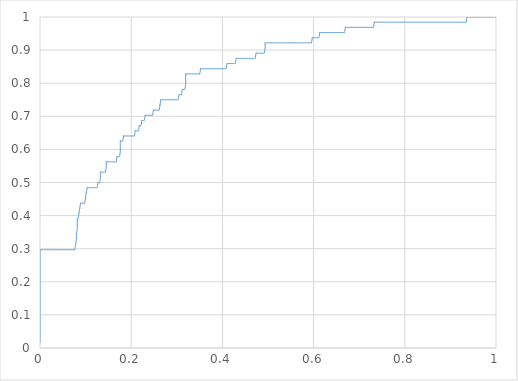
| Category | Series 0 |
|---|---|
| 0.0 | 0.016 |
| 0.0 | 0.031 |
| 0.0 | 0.047 |
| 0.0 | 0.062 |
| 0.0 | 0.078 |
| 0.0 | 0.094 |
| 0.0 | 0.109 |
| 0.0 | 0.125 |
| 0.0 | 0.141 |
| 0.0 | 0.156 |
| 0.0 | 0.172 |
| 0.0 | 0.188 |
| 0.0 | 0.203 |
| 0.0 | 0.219 |
| 0.0 | 0.234 |
| 0.0 | 0.25 |
| 0.0 | 0.266 |
| 0.0 | 0.281 |
| 0.0 | 0.297 |
| 0.0 | 0.297 |
| 0.001814882032667886 | 0.297 |
| 0.003629764065335772 | 0.297 |
| 0.005444646098003658 | 0.297 |
| 0.007259528130671544 | 0.297 |
| 0.00907441016333943 | 0.297 |
| 0.010889292196007205 | 0.297 |
| 0.012704174228675091 | 0.297 |
| 0.014519056261342977 | 0.297 |
| 0.016333938294010864 | 0.297 |
| 0.01814882032667875 | 0.297 |
| 0.019963702359346636 | 0.297 |
| 0.02177858439201452 | 0.297 |
| 0.023593466424682408 | 0.297 |
| 0.025408348457350294 | 0.297 |
| 0.02722323049001818 | 0.297 |
| 0.029038112522686066 | 0.297 |
| 0.030852994555353952 | 0.297 |
| 0.03266787658802173 | 0.297 |
| 0.03448275862068961 | 0.297 |
| 0.0362976406533575 | 0.297 |
| 0.038112522686025385 | 0.297 |
| 0.03992740471869327 | 0.297 |
| 0.04174228675136116 | 0.297 |
| 0.04355716878402904 | 0.297 |
| 0.04537205081669693 | 0.297 |
| 0.047186932849364815 | 0.297 |
| 0.0490018148820327 | 0.297 |
| 0.05081669691470059 | 0.297 |
| 0.052631578947368474 | 0.297 |
| 0.05444646098003625 | 0.297 |
| 0.056261343012704135 | 0.297 |
| 0.05807622504537202 | 0.297 |
| 0.05989110707803991 | 0.297 |
| 0.06170598911070779 | 0.297 |
| 0.06352087114337568 | 0.297 |
| 0.06533575317604357 | 0.297 |
| 0.06715063520871145 | 0.297 |
| 0.06896551724137934 | 0.297 |
| 0.07078039927404722 | 0.297 |
| 0.07259528130671511 | 0.297 |
| 0.074410163339383 | 0.297 |
| 0.07622504537205077 | 0.297 |
| 0.07803992740471866 | 0.312 |
| 0.07803992740471866 | 0.312 |
| 0.07985480943738654 | 0.328 |
| 0.07985480943738654 | 0.344 |
| 0.07985480943738654 | 0.344 |
| 0.08166969147005443 | 0.359 |
| 0.08166969147005443 | 0.375 |
| 0.08166969147005443 | 0.391 |
| 0.08166969147005443 | 0.391 |
| 0.08348457350272231 | 0.391 |
| 0.0852994555353902 | 0.406 |
| 0.0852994555353902 | 0.406 |
| 0.08711433756805809 | 0.422 |
| 0.08711433756805809 | 0.422 |
| 0.08892921960072597 | 0.438 |
| 0.08892921960072597 | 0.438 |
| 0.09074410163339386 | 0.438 |
| 0.09255898366606174 | 0.438 |
| 0.09437386569872963 | 0.438 |
| 0.0961887477313974 | 0.438 |
| 0.09800362976406529 | 0.438 |
| 0.09981851179673318 | 0.453 |
| 0.09981851179673318 | 0.453 |
| 0.10163339382940106 | 0.469 |
| 0.10163339382940106 | 0.469 |
| 0.10344827586206895 | 0.484 |
| 0.10344827586206895 | 0.484 |
| 0.10526315789473684 | 0.484 |
| 0.10707803992740472 | 0.484 |
| 0.10889292196007261 | 0.484 |
| 0.1107078039927405 | 0.484 |
| 0.11252268602540838 | 0.484 |
| 0.11433756805807627 | 0.484 |
| 0.11615245009074415 | 0.484 |
| 0.11796733212341193 | 0.484 |
| 0.11978221415607981 | 0.484 |
| 0.1215970961887477 | 0.484 |
| 0.12341197822141559 | 0.484 |
| 0.12522686025408347 | 0.484 |
| 0.12704174228675136 | 0.5 |
| 0.12704174228675136 | 0.5 |
| 0.12885662431941924 | 0.5 |
| 0.13067150635208713 | 0.5 |
| 0.13248638838475502 | 0.516 |
| 0.13248638838475502 | 0.531 |
| 0.13248638838475502 | 0.531 |
| 0.1343012704174229 | 0.531 |
| 0.1361161524500908 | 0.531 |
| 0.13793103448275867 | 0.531 |
| 0.13974591651542645 | 0.531 |
| 0.14156079854809434 | 0.531 |
| 0.14337568058076222 | 0.531 |
| 0.1451905626134301 | 0.547 |
| 0.1451905626134301 | 0.562 |
| 0.1451905626134301 | 0.562 |
| 0.147005444646098 | 0.562 |
| 0.14882032667876588 | 0.562 |
| 0.15063520871143377 | 0.562 |
| 0.15245009074410165 | 0.562 |
| 0.15426497277676954 | 0.562 |
| 0.15607985480943742 | 0.562 |
| 0.1578947368421053 | 0.562 |
| 0.15970961887477308 | 0.562 |
| 0.16152450090744097 | 0.562 |
| 0.16333938294010886 | 0.562 |
| 0.16515426497277674 | 0.562 |
| 0.16696914700544463 | 0.562 |
| 0.16878402903811252 | 0.578 |
| 0.16878402903811252 | 0.578 |
| 0.1705989110707804 | 0.578 |
| 0.1724137931034483 | 0.578 |
| 0.17422867513611617 | 0.578 |
| 0.17604355716878406 | 0.594 |
| 0.17604355716878406 | 0.609 |
| 0.17604355716878406 | 0.625 |
| 0.17604355716878406 | 0.625 |
| 0.17785843920145195 | 0.625 |
| 0.17967332123411983 | 0.625 |
| 0.1814882032667876 | 0.625 |
| 0.1833030852994555 | 0.641 |
| 0.1833030852994555 | 0.641 |
| 0.18511796733212338 | 0.641 |
| 0.18693284936479126 | 0.641 |
| 0.18874773139745915 | 0.641 |
| 0.19056261343012704 | 0.641 |
| 0.19237749546279492 | 0.641 |
| 0.1941923774954628 | 0.641 |
| 0.1960072595281307 | 0.641 |
| 0.19782214156079858 | 0.641 |
| 0.19963702359346647 | 0.641 |
| 0.20145190562613435 | 0.641 |
| 0.20326678765880213 | 0.641 |
| 0.20508166969147001 | 0.641 |
| 0.2068965517241379 | 0.641 |
| 0.2087114337568058 | 0.656 |
| 0.2087114337568058 | 0.656 |
| 0.21052631578947367 | 0.656 |
| 0.21234119782214156 | 0.656 |
| 0.21415607985480944 | 0.656 |
| 0.21597096188747733 | 0.656 |
| 0.21778584392014522 | 0.672 |
| 0.21778584392014522 | 0.672 |
| 0.2196007259528131 | 0.672 |
| 0.221415607985481 | 0.672 |
| 0.22323049001814887 | 0.688 |
| 0.22323049001814887 | 0.688 |
| 0.22504537205081665 | 0.688 |
| 0.22686025408348454 | 0.688 |
| 0.22867513611615242 | 0.688 |
| 0.2304900181488203 | 0.703 |
| 0.2304900181488203 | 0.703 |
| 0.2323049001814882 | 0.703 |
| 0.23411978221415608 | 0.703 |
| 0.23593466424682397 | 0.703 |
| 0.23774954627949185 | 0.703 |
| 0.23956442831215974 | 0.703 |
| 0.24137931034482762 | 0.703 |
| 0.2431941923774955 | 0.703 |
| 0.24500907441016329 | 0.703 |
| 0.24682395644283117 | 0.703 |
| 0.24863883847549906 | 0.719 |
| 0.24863883847549906 | 0.719 |
| 0.25045372050816694 | 0.719 |
| 0.25226860254083483 | 0.719 |
| 0.2540834845735027 | 0.719 |
| 0.2558983666061706 | 0.719 |
| 0.2577132486388385 | 0.719 |
| 0.2595281306715064 | 0.719 |
| 0.26134301270417426 | 0.719 |
| 0.26315789473684215 | 0.734 |
| 0.26315789473684215 | 0.734 |
| 0.26497277676951003 | 0.75 |
| 0.26497277676951003 | 0.75 |
| 0.2667876588021778 | 0.75 |
| 0.2686025408348457 | 0.75 |
| 0.2704174228675136 | 0.75 |
| 0.27223230490018147 | 0.75 |
| 0.27404718693284935 | 0.75 |
| 0.27586206896551724 | 0.75 |
| 0.2776769509981851 | 0.75 |
| 0.279491833030853 | 0.75 |
| 0.2813067150635209 | 0.75 |
| 0.2831215970961888 | 0.75 |
| 0.28493647912885667 | 0.75 |
| 0.28675136116152455 | 0.75 |
| 0.28856624319419233 | 0.75 |
| 0.2903811252268602 | 0.75 |
| 0.2921960072595281 | 0.75 |
| 0.294010889292196 | 0.75 |
| 0.2958257713248639 | 0.75 |
| 0.29764065335753176 | 0.75 |
| 0.29945553539019965 | 0.75 |
| 0.30127041742286753 | 0.75 |
| 0.3030852994555354 | 0.75 |
| 0.3049001814882033 | 0.766 |
| 0.3049001814882033 | 0.766 |
| 0.3067150635208712 | 0.766 |
| 0.30852994555353896 | 0.766 |
| 0.31034482758620685 | 0.766 |
| 0.31215970961887474 | 0.781 |
| 0.31215970961887474 | 0.781 |
| 0.3139745916515426 | 0.781 |
| 0.3157894736842105 | 0.781 |
| 0.3176043557168784 | 0.781 |
| 0.3194192377495463 | 0.797 |
| 0.3194192377495463 | 0.812 |
| 0.3194192377495463 | 0.828 |
| 0.3194192377495463 | 0.828 |
| 0.32123411978221417 | 0.828 |
| 0.32304900181488205 | 0.828 |
| 0.32486388384754994 | 0.828 |
| 0.3266787658802178 | 0.828 |
| 0.3284936479128857 | 0.828 |
| 0.3303085299455535 | 0.828 |
| 0.3321234119782214 | 0.828 |
| 0.33393829401088926 | 0.828 |
| 0.33575317604355714 | 0.828 |
| 0.33756805807622503 | 0.828 |
| 0.3393829401088929 | 0.828 |
| 0.3411978221415608 | 0.828 |
| 0.3430127041742287 | 0.828 |
| 0.3448275862068966 | 0.828 |
| 0.34664246823956446 | 0.828 |
| 0.34845735027223235 | 0.828 |
| 0.35027223230490023 | 0.828 |
| 0.352087114337568 | 0.844 |
| 0.352087114337568 | 0.844 |
| 0.3539019963702359 | 0.844 |
| 0.3557168784029038 | 0.844 |
| 0.35753176043557167 | 0.844 |
| 0.35934664246823955 | 0.844 |
| 0.36116152450090744 | 0.844 |
| 0.3629764065335753 | 0.844 |
| 0.3647912885662432 | 0.844 |
| 0.3666061705989111 | 0.844 |
| 0.368421052631579 | 0.844 |
| 0.37023593466424687 | 0.844 |
| 0.37205081669691475 | 0.844 |
| 0.37386569872958253 | 0.844 |
| 0.3756805807622504 | 0.844 |
| 0.3774954627949183 | 0.844 |
| 0.3793103448275862 | 0.844 |
| 0.3811252268602541 | 0.844 |
| 0.38294010889292196 | 0.844 |
| 0.38475499092558985 | 0.844 |
| 0.38656987295825773 | 0.844 |
| 0.3883847549909256 | 0.844 |
| 0.3901996370235935 | 0.844 |
| 0.3920145190562614 | 0.844 |
| 0.39382940108892917 | 0.844 |
| 0.39564428312159705 | 0.844 |
| 0.39745916515426494 | 0.844 |
| 0.3992740471869328 | 0.844 |
| 0.4010889292196007 | 0.844 |
| 0.4029038112522686 | 0.844 |
| 0.4047186932849365 | 0.844 |
| 0.40653357531760437 | 0.844 |
| 0.40834845735027225 | 0.844 |
| 0.41016333938294014 | 0.859 |
| 0.41016333938294014 | 0.859 |
| 0.411978221415608 | 0.859 |
| 0.4137931034482759 | 0.859 |
| 0.4156079854809437 | 0.859 |
| 0.4174228675136116 | 0.859 |
| 0.41923774954627946 | 0.859 |
| 0.42105263157894735 | 0.859 |
| 0.42286751361161523 | 0.859 |
| 0.4246823956442831 | 0.859 |
| 0.426497277676951 | 0.859 |
| 0.4283121597096189 | 0.859 |
| 0.4301270417422868 | 0.875 |
| 0.4301270417422868 | 0.875 |
| 0.43194192377495466 | 0.875 |
| 0.43375680580762255 | 0.875 |
| 0.43557168784029043 | 0.875 |
| 0.4373865698729582 | 0.875 |
| 0.4392014519056261 | 0.875 |
| 0.441016333938294 | 0.875 |
| 0.44283121597096187 | 0.875 |
| 0.44464609800362975 | 0.875 |
| 0.44646098003629764 | 0.875 |
| 0.4482758620689655 | 0.875 |
| 0.4500907441016334 | 0.875 |
| 0.4519056261343013 | 0.875 |
| 0.4537205081669692 | 0.875 |
| 0.45553539019963707 | 0.875 |
| 0.45735027223230496 | 0.875 |
| 0.45916515426497273 | 0.875 |
| 0.4609800362976406 | 0.875 |
| 0.4627949183303085 | 0.875 |
| 0.4646098003629764 | 0.875 |
| 0.4664246823956443 | 0.875 |
| 0.46823956442831216 | 0.875 |
| 0.47005444646098005 | 0.875 |
| 0.47186932849364793 | 0.875 |
| 0.4736842105263158 | 0.891 |
| 0.4736842105263158 | 0.891 |
| 0.4754990925589837 | 0.891 |
| 0.4773139745916516 | 0.891 |
| 0.47912885662431937 | 0.891 |
| 0.48094373865698725 | 0.891 |
| 0.48275862068965514 | 0.891 |
| 0.484573502722323 | 0.891 |
| 0.4863883847549909 | 0.891 |
| 0.4882032667876588 | 0.891 |
| 0.4900181488203267 | 0.891 |
| 0.49183303085299457 | 0.891 |
| 0.49364791288566245 | 0.906 |
| 0.49364791288566245 | 0.922 |
| 0.49364791288566245 | 0.922 |
| 0.49546279491833034 | 0.922 |
| 0.4972776769509982 | 0.922 |
| 0.4990925589836661 | 0.922 |
| 0.5009074410163339 | 0.922 |
| 0.5027223230490019 | 0.922 |
| 0.5045372050816697 | 0.922 |
| 0.5063520871143375 | 0.922 |
| 0.5081669691470054 | 0.922 |
| 0.5099818511796733 | 0.922 |
| 0.5117967332123412 | 0.922 |
| 0.5136116152450091 | 0.922 |
| 0.515426497277677 | 0.922 |
| 0.5172413793103448 | 0.922 |
| 0.5190562613430127 | 0.922 |
| 0.5208711433756805 | 0.922 |
| 0.5226860254083485 | 0.922 |
| 0.5245009074410163 | 0.922 |
| 0.5263157894736843 | 0.922 |
| 0.5281306715063521 | 0.922 |
| 0.52994555353902 | 0.922 |
| 0.5317604355716878 | 0.922 |
| 0.5335753176043557 | 0.922 |
| 0.5353901996370236 | 0.922 |
| 0.5372050816696915 | 0.922 |
| 0.5390199637023594 | 0.922 |
| 0.5408348457350272 | 0.922 |
| 0.5426497277676952 | 0.922 |
| 0.5444646098003629 | 0.922 |
| 0.5462794918330309 | 0.922 |
| 0.5480943738656987 | 0.922 |
| 0.5499092558983666 | 0.922 |
| 0.5517241379310345 | 0.922 |
| 0.5535390199637024 | 0.922 |
| 0.5553539019963702 | 0.922 |
| 0.5571687840290381 | 0.922 |
| 0.558983666061706 | 0.922 |
| 0.5607985480943738 | 0.922 |
| 0.5626134301270418 | 0.922 |
| 0.5644283121597096 | 0.922 |
| 0.5662431941923776 | 0.922 |
| 0.5680580762250453 | 0.922 |
| 0.5698729582577132 | 0.922 |
| 0.5716878402903811 | 0.922 |
| 0.573502722323049 | 0.922 |
| 0.5753176043557169 | 0.922 |
| 0.5771324863883848 | 0.922 |
| 0.5789473684210527 | 0.922 |
| 0.5807622504537204 | 0.922 |
| 0.5825771324863884 | 0.922 |
| 0.5843920145190562 | 0.922 |
| 0.5862068965517242 | 0.922 |
| 0.588021778584392 | 0.922 |
| 0.58983666061706 | 0.922 |
| 0.5916515426497277 | 0.922 |
| 0.5934664246823956 | 0.922 |
| 0.5952813067150635 | 0.922 |
| 0.5970961887477314 | 0.938 |
| 0.5970961887477314 | 0.938 |
| 0.5989110707803993 | 0.938 |
| 0.6007259528130672 | 0.938 |
| 0.6025408348457351 | 0.938 |
| 0.6043557168784028 | 0.938 |
| 0.6061705989110708 | 0.938 |
| 0.6079854809437386 | 0.938 |
| 0.6098003629764066 | 0.938 |
| 0.6116152450090744 | 0.938 |
| 0.6134301270417423 | 0.953 |
| 0.6134301270417423 | 0.953 |
| 0.6152450090744102 | 0.953 |
| 0.617059891107078 | 0.953 |
| 0.6188747731397459 | 0.953 |
| 0.6206896551724138 | 0.953 |
| 0.6225045372050817 | 0.953 |
| 0.6243194192377495 | 0.953 |
| 0.6261343012704175 | 0.953 |
| 0.6279491833030852 | 0.953 |
| 0.6297640653357532 | 0.953 |
| 0.631578947368421 | 0.953 |
| 0.6333938294010889 | 0.953 |
| 0.6352087114337568 | 0.953 |
| 0.6370235934664247 | 0.953 |
| 0.6388384754990926 | 0.953 |
| 0.6406533575317604 | 0.953 |
| 0.6424682395644283 | 0.953 |
| 0.6442831215970961 | 0.953 |
| 0.6460980036297641 | 0.953 |
| 0.6479128856624319 | 0.953 |
| 0.6497277676950999 | 0.953 |
| 0.6515426497277677 | 0.953 |
| 0.6533575317604357 | 0.953 |
| 0.6551724137931034 | 0.953 |
| 0.6569872958257713 | 0.953 |
| 0.6588021778584392 | 0.953 |
| 0.6606170598911071 | 0.953 |
| 0.662431941923775 | 0.953 |
| 0.6642468239564429 | 0.953 |
| 0.6660617059891107 | 0.953 |
| 0.6678765880217785 | 0.953 |
| 0.6696914700544465 | 0.969 |
| 0.6696914700544465 | 0.969 |
| 0.6715063520871143 | 0.969 |
| 0.6733212341197823 | 0.969 |
| 0.6751361161524501 | 0.969 |
| 0.676950998185118 | 0.969 |
| 0.6787658802177858 | 0.969 |
| 0.6805807622504537 | 0.969 |
| 0.6823956442831216 | 0.969 |
| 0.6842105263157895 | 0.969 |
| 0.6860254083484574 | 0.969 |
| 0.6878402903811252 | 0.969 |
| 0.6896551724137931 | 0.969 |
| 0.6914700544464609 | 0.969 |
| 0.6932849364791289 | 0.969 |
| 0.6950998185117967 | 0.969 |
| 0.6969147005444646 | 0.969 |
| 0.6987295825771325 | 0.969 |
| 0.7005444646098004 | 0.969 |
| 0.7023593466424682 | 0.969 |
| 0.7041742286751361 | 0.969 |
| 0.705989110707804 | 0.969 |
| 0.7078039927404718 | 0.969 |
| 0.7096188747731398 | 0.969 |
| 0.7114337568058076 | 0.969 |
| 0.7132486388384756 | 0.969 |
| 0.7150635208711433 | 0.969 |
| 0.7168784029038113 | 0.969 |
| 0.7186932849364791 | 0.969 |
| 0.720508166969147 | 0.969 |
| 0.7223230490018149 | 0.969 |
| 0.7241379310344828 | 0.969 |
| 0.7259528130671506 | 0.969 |
| 0.7277676950998185 | 0.969 |
| 0.7295825771324864 | 0.969 |
| 0.7313974591651542 | 0.969 |
| 0.7332123411978222 | 0.984 |
| 0.7332123411978222 | 0.984 |
| 0.73502722323049 | 0.984 |
| 0.736842105263158 | 0.984 |
| 0.7386569872958257 | 0.984 |
| 0.7404718693284936 | 0.984 |
| 0.7422867513611615 | 0.984 |
| 0.7441016333938294 | 0.984 |
| 0.7459165154264973 | 0.984 |
| 0.7477313974591652 | 0.984 |
| 0.7495462794918331 | 0.984 |
| 0.7513611615245009 | 0.984 |
| 0.7531760435571688 | 0.984 |
| 0.7549909255898366 | 0.984 |
| 0.7568058076225046 | 0.984 |
| 0.7586206896551724 | 0.984 |
| 0.7604355716878403 | 0.984 |
| 0.7622504537205081 | 0.984 |
| 0.764065335753176 | 0.984 |
| 0.7658802177858439 | 0.984 |
| 0.7676950998185118 | 0.984 |
| 0.7695099818511797 | 0.984 |
| 0.7713248638838476 | 0.984 |
| 0.7731397459165155 | 0.984 |
| 0.7749546279491832 | 0.984 |
| 0.7767695099818512 | 0.984 |
| 0.778584392014519 | 0.984 |
| 0.7803992740471869 | 0.984 |
| 0.7822141560798548 | 0.984 |
| 0.7840290381125227 | 0.984 |
| 0.7858439201451906 | 0.984 |
| 0.7876588021778584 | 0.984 |
| 0.7894736842105263 | 0.984 |
| 0.7912885662431942 | 0.984 |
| 0.7931034482758621 | 0.984 |
| 0.79491833030853 | 0.984 |
| 0.7967332123411979 | 0.984 |
| 0.7985480943738656 | 0.984 |
| 0.8003629764065336 | 0.984 |
| 0.8021778584392014 | 0.984 |
| 0.8039927404718693 | 0.984 |
| 0.8058076225045372 | 0.984 |
| 0.8076225045372051 | 0.984 |
| 0.809437386569873 | 0.984 |
| 0.8112522686025408 | 0.984 |
| 0.8130671506352087 | 0.984 |
| 0.8148820326678766 | 0.984 |
| 0.8166969147005445 | 0.984 |
| 0.8185117967332123 | 0.984 |
| 0.8203266787658803 | 0.984 |
| 0.822141560798548 | 0.984 |
| 0.8239564428312159 | 0.984 |
| 0.8257713248638838 | 0.984 |
| 0.8275862068965517 | 0.984 |
| 0.8294010889292196 | 0.984 |
| 0.8312159709618875 | 0.984 |
| 0.8330308529945554 | 0.984 |
| 0.8348457350272233 | 0.984 |
| 0.8366606170598911 | 0.984 |
| 0.8384754990925589 | 0.984 |
| 0.8402903811252269 | 0.984 |
| 0.8421052631578947 | 0.984 |
| 0.8439201451905626 | 0.984 |
| 0.8457350272232305 | 0.984 |
| 0.8475499092558983 | 0.984 |
| 0.8493647912885662 | 0.984 |
| 0.8511796733212341 | 0.984 |
| 0.852994555353902 | 0.984 |
| 0.8548094373865699 | 0.984 |
| 0.8566243194192378 | 0.984 |
| 0.8584392014519057 | 0.984 |
| 0.8602540834845736 | 0.984 |
| 0.8620689655172413 | 0.984 |
| 0.8638838475499093 | 0.984 |
| 0.8656987295825771 | 0.984 |
| 0.867513611615245 | 0.984 |
| 0.8693284936479129 | 0.984 |
| 0.8711433756805808 | 0.984 |
| 0.8729582577132486 | 0.984 |
| 0.8747731397459165 | 0.984 |
| 0.8765880217785844 | 0.984 |
| 0.8784029038112523 | 0.984 |
| 0.8802177858439202 | 0.984 |
| 0.882032667876588 | 0.984 |
| 0.883847549909256 | 0.984 |
| 0.8856624319419237 | 0.984 |
| 0.8874773139745916 | 0.984 |
| 0.8892921960072595 | 0.984 |
| 0.8911070780399274 | 0.984 |
| 0.8929219600725953 | 0.984 |
| 0.8947368421052632 | 0.984 |
| 0.896551724137931 | 0.984 |
| 0.8983666061705989 | 0.984 |
| 0.9001814882032668 | 0.984 |
| 0.9019963702359347 | 0.984 |
| 0.9038112522686026 | 0.984 |
| 0.9056261343012704 | 0.984 |
| 0.9074410163339383 | 0.984 |
| 0.9092558983666061 | 0.984 |
| 0.911070780399274 | 0.984 |
| 0.9128856624319419 | 0.984 |
| 0.9147005444646098 | 0.984 |
| 0.9165154264972777 | 0.984 |
| 0.9183303085299456 | 0.984 |
| 0.9201451905626135 | 0.984 |
| 0.9219600725952813 | 0.984 |
| 0.9237749546279492 | 0.984 |
| 0.925589836660617 | 0.984 |
| 0.9274047186932849 | 0.984 |
| 0.9292196007259528 | 0.984 |
| 0.9310344827586207 | 0.984 |
| 0.9328493647912885 | 0.984 |
| 0.9346642468239564 | 0.984 |
| 0.9364791288566243 | 1 |
| 0.9364791288566243 | 1 |
| 0.9382940108892922 | 1 |
| 0.9401088929219601 | 1 |
| 0.941923774954628 | 1 |
| 0.9437386569872959 | 1 |
| 0.9455535390199638 | 1 |
| 0.9473684210526316 | 1 |
| 0.9491833030852994 | 1 |
| 0.9509981851179673 | 1 |
| 0.9528130671506352 | 1 |
| 0.9546279491833031 | 1 |
| 0.956442831215971 | 1 |
| 0.9582577132486388 | 1 |
| 0.9600725952813067 | 1 |
| 0.9618874773139746 | 1 |
| 0.9637023593466425 | 1 |
| 0.9655172413793104 | 1 |
| 0.9673321234119783 | 1 |
| 0.969147005444646 | 1 |
| 0.9709618874773139 | 1 |
| 0.9727767695099818 | 1 |
| 0.9745916515426497 | 1 |
| 0.9764065335753176 | 1 |
| 0.9782214156079855 | 1 |
| 0.9800362976406534 | 1 |
| 0.9818511796733213 | 1 |
| 0.9836660617059891 | 1 |
| 0.985480943738657 | 1 |
| 0.9872958257713249 | 1 |
| 0.9891107078039928 | 1 |
| 0.9909255898366606 | 1 |
| 0.9927404718693285 | 1 |
| 0.9945553539019963 | 1 |
| 0.9963702359346642 | 1 |
| 0.9981851179673321 | 1 |
| 1.0 | 1 |